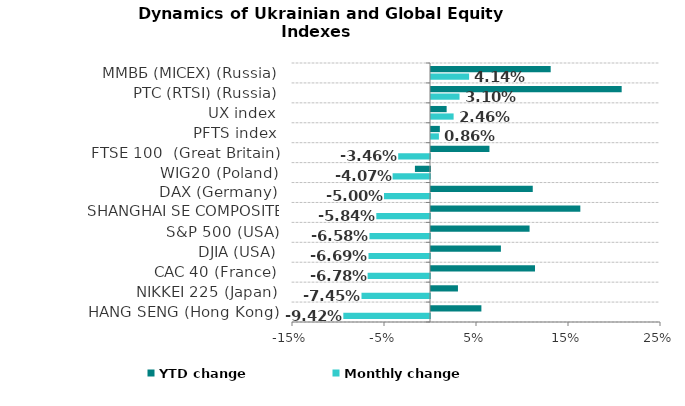
| Category | Monthly change | YTD change |
|---|---|---|
| HANG SENG (Hong Kong) | -0.094 | 0.055 |
| NIKKEI 225 (Japan) | -0.074 | 0.029 |
| CAC 40 (France) | -0.068 | 0.113 |
| DJIA (USA) | -0.067 | 0.076 |
| S&P 500 (USA) | -0.066 | 0.107 |
| SHANGHAI SE COMPOSITE (China) | -0.058 | 0.162 |
| DAX (Germany) | -0.05 | 0.111 |
| WIG20 (Poland) | -0.041 | -0.016 |
| FTSE 100  (Great Britain) | -0.035 | 0.064 |
| PFTS index | 0.009 | 0.01 |
| UX index | 0.025 | 0.017 |
| РТС (RTSI) (Russia) | 0.031 | 0.207 |
| ММВБ (MICEX) (Russia) | 0.041 | 0.13 |